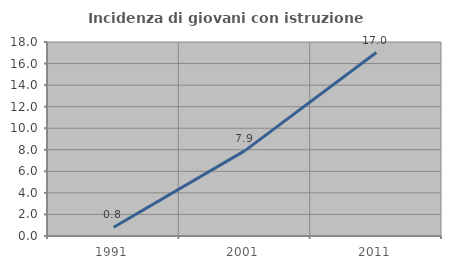
| Category | Incidenza di giovani con istruzione universitaria |
|---|---|
| 1991.0 | 0.806 |
| 2001.0 | 7.921 |
| 2011.0 | 17.021 |